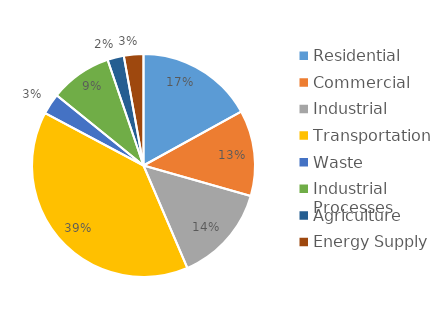
| Category | Series 0 |
|---|---|
| Residential | 2707592 |
| Commercial | 1984985 |
| Industrial | 2258017 |
| Transportation | 6258857 |
| Waste | 482047 |
| Industrial Processes | 1430459.896 |
| Agriculture | 379096 |
| Energy Supply | 452581 |